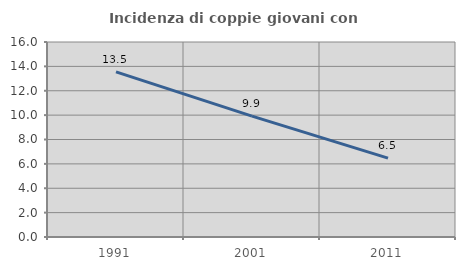
| Category | Incidenza di coppie giovani con figli |
|---|---|
| 1991.0 | 13.549 |
| 2001.0 | 9.922 |
| 2011.0 | 6.469 |